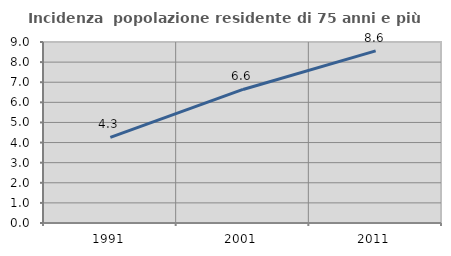
| Category | Incidenza  popolazione residente di 75 anni e più |
|---|---|
| 1991.0 | 4.255 |
| 2001.0 | 6.64 |
| 2011.0 | 8.561 |